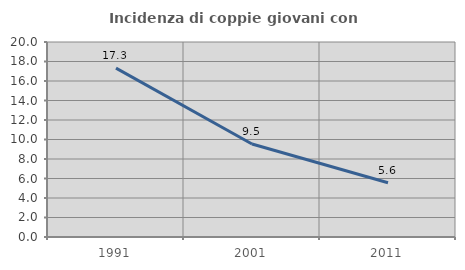
| Category | Incidenza di coppie giovani con figli |
|---|---|
| 1991.0 | 17.318 |
| 2001.0 | 9.532 |
| 2011.0 | 5.565 |